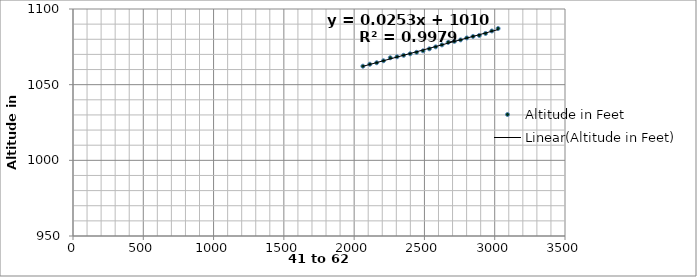
| Category | Altitude in Feet |
|---|---|
| 2062.19762136382 | 1062.194 |
| 2111.5143496448172 | 1063.506 |
| 2160.282084898127 | 1064.49 |
| 2208.7955515549183 | 1065.802 |
| 2257.1989770742657 | 1067.77 |
| 2304.889865756096 | 1068.426 |
| 2351.927193234087 | 1069.41 |
| 2398.3521367410635 | 1070.395 |
| 2444.2120653716524 | 1071.379 |
| 2489.873652346958 | 1072.363 |
| 2535.0441595122625 | 1073.675 |
| 2579.805222926589 | 1074.987 |
| 2624.416362544273 | 1076.299 |
| 2668.7183175896034 | 1077.939 |
| 2712.9998762282357 | 1078.596 |
| 2757.2062536583007 | 1079.58 |
| 2801.1552858481 | 1080.892 |
| 2845.689721865986 | 1081.876 |
| 2890.351109908465 | 1082.532 |
| 2934.7795359097213 | 1083.844 |
| 2979.442875773171 | 1085.484 |
| 3024.17366074571 | 1087.125 |